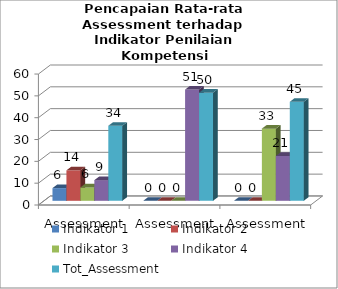
| Category | Indikator 1 | Indikator 2 | Indikator 3 | Indikator 4 | Tot_Assessment |
|---|---|---|---|---|---|
| Assessment 1 | 5.824 | 13.971 | 6.118 | 9.471 | 34.371 |
| Assessment 2 | 0 | 0 | 0 | 50.974 | 49.517 |
| Assessment 3 | 0 | 0 | 33.067 | 20.552 | 45.371 |